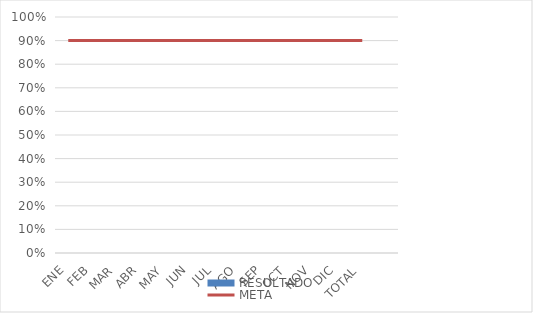
| Category | RESULTADO |
|---|---|
| ENE | 0 |
| FEB | 0 |
| MAR | 0 |
| ABR | 0 |
| MAY | 0 |
| JUN | 0 |
| JUL | 0 |
| AGO | 0 |
| SEP | 0 |
| OCT | 0 |
| NOV | 0 |
| DIC | 0 |
| TOTAL | 0 |